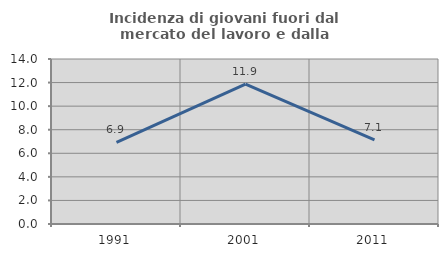
| Category | Incidenza di giovani fuori dal mercato del lavoro e dalla formazione  |
|---|---|
| 1991.0 | 6.931 |
| 2001.0 | 11.864 |
| 2011.0 | 7.143 |